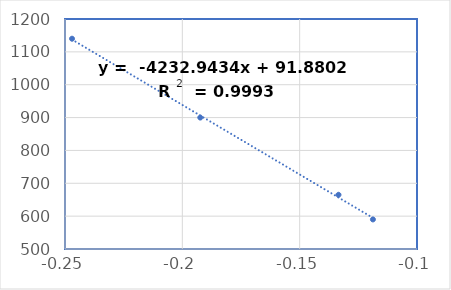
| Category | Series 0 |
|---|---|
| -0.11877858802154186 | 590 |
| -0.13345673553112353 | 665 |
| -0.1923546033774519 | 900 |
| -0.24700429583819258 | 1140 |